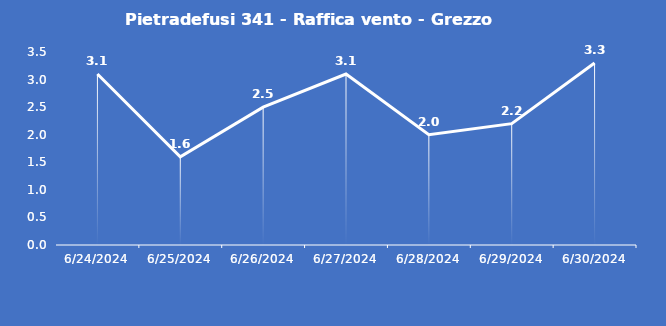
| Category | Pietradefusi 341 - Raffica vento - Grezzo (m/s) |
|---|---|
| 6/24/24 | 3.1 |
| 6/25/24 | 1.6 |
| 6/26/24 | 2.5 |
| 6/27/24 | 3.1 |
| 6/28/24 | 2 |
| 6/29/24 | 2.2 |
| 6/30/24 | 3.3 |